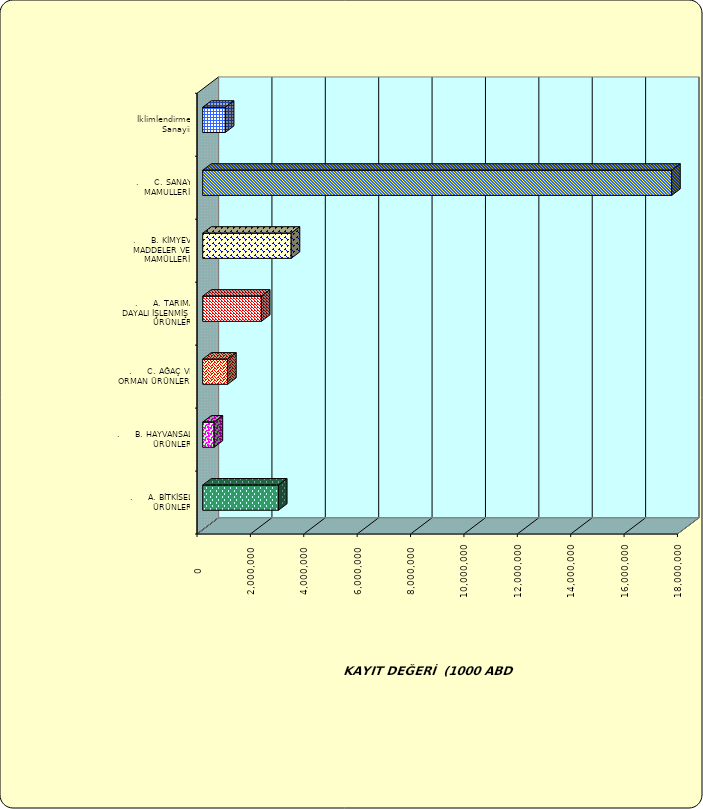
| Category | Series 0 |
|---|---|
| .     A. BİTKİSEL ÜRÜNLER | 2837763.127 |
| .     B. HAYVANSAL ÜRÜNLER | 426471.117 |
| .     C. AĞAÇ VE ORMAN ÜRÜNLERİ | 933504.714 |
| .     A. TARIMA DAYALI İŞLENMİŞ ÜRÜNLER | 2199415.065 |
| .     B. KİMYEVİ MADDELER VE MAMÜLLERİ | 3315133.837 |
| .     C. SANAYİ MAMULLERİ | 17569276.347 |
|  İklimlendirme Sanayii | 846821.915 |